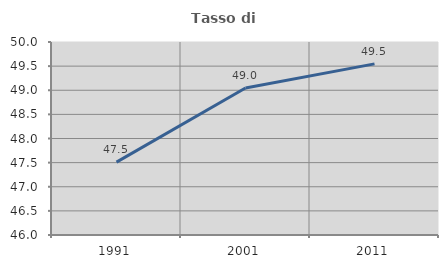
| Category | Tasso di occupazione   |
|---|---|
| 1991.0 | 47.51 |
| 2001.0 | 49.048 |
| 2011.0 | 49.547 |